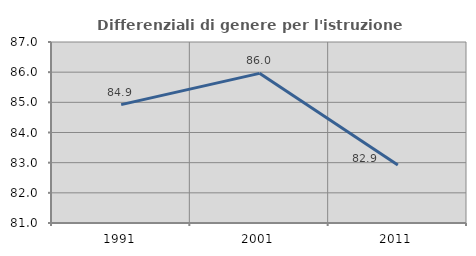
| Category | Differenziali di genere per l'istruzione superiore |
|---|---|
| 1991.0 | 84.923 |
| 2001.0 | 85.961 |
| 2011.0 | 82.921 |